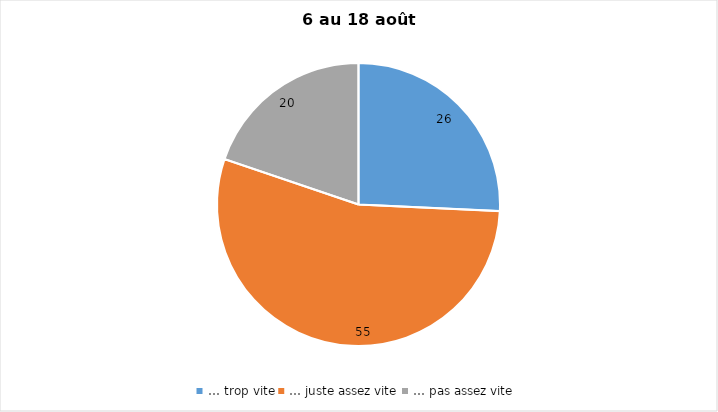
| Category | Series 0 |
|---|---|
| … trop vite | 26 |
| … juste assez vite | 55 |
| … pas assez vite | 20 |